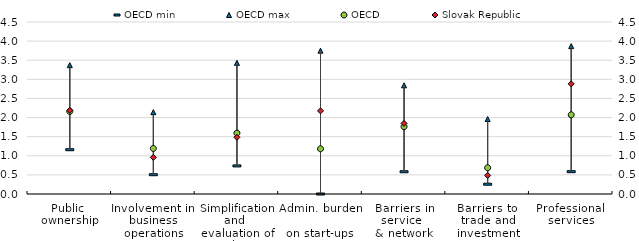
| Category | OECD min | OECD max | OECD |
|---|---|---|---|
| Public 
ownership | 1.159 | 3.371 | 2.161 |
| Involvement in 
business operations | 0.505 | 2.141 | 1.191 |
| Simplification and 
evaluation of regulations | 0.735 | 3.432 | 1.593 |
| Admin. burden  
on start-ups  | 0 | 3.75 | 1.183 |
| Barriers in service  
& network sectors | 0.582 | 2.844 | 1.762 |
| Barriers to 
trade and investment | 0.256 | 1.962 | 0.687 |
| Professional 
services | 0.585 | 3.869 | 2.071 |